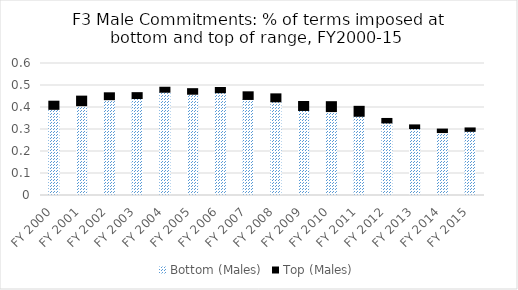
| Category | Bottom (Males) | Top (Males) |
|---|---|---|
| FY 2000 | 0.392 | 0.037 |
| FY 2001 | 0.408 | 0.044 |
| FY 2002 | 0.436 | 0.031 |
| FY 2003 | 0.441 | 0.027 |
| FY 2004 | 0.469 | 0.023 |
| FY 2005 | 0.46 | 0.025 |
| FY 2006 | 0.467 | 0.024 |
| FY 2007 | 0.437 | 0.035 |
| FY 2008 | 0.426 | 0.036 |
| FY 2009 | 0.387 | 0.041 |
| FY 2010 | 0.381 | 0.045 |
| FY 2011 | 0.36 | 0.045 |
| FY 2012 | 0.33 | 0.02 |
| FY 2013 | 0.304 | 0.017 |
| FY 2014 | 0.286 | 0.016 |
| FY 2015 | 0.292 | 0.015 |